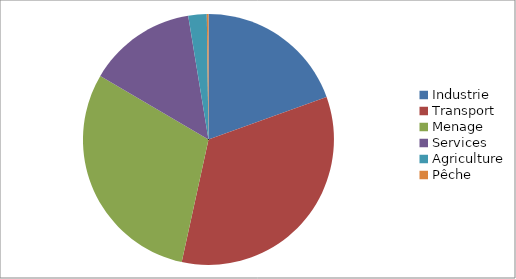
| Category | Series 0 |
|---|---|
| Industrie | 28.99 |
| Transport | 50.4 |
| Menage | 44.62 |
| Services | 20.74 |
| Agriculture | 3.53 |
| Pêche | 0.32 |